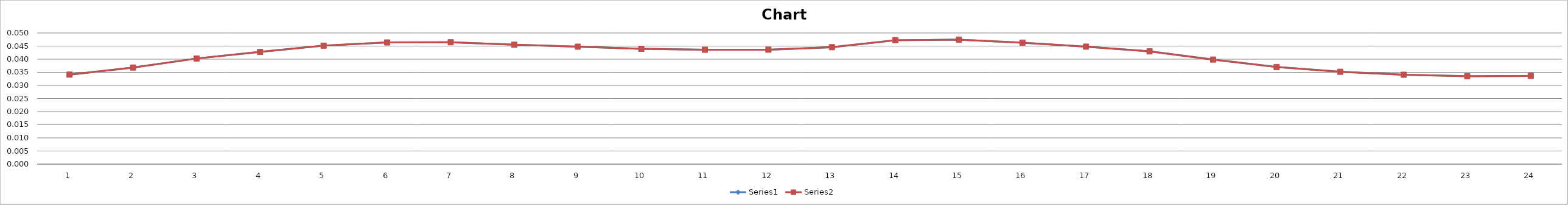
| Category | Series 0 | Series 1 |
|---|---|---|
| 0 | 0.034 | 0.034 |
| 1 | 0.037 | 0.037 |
| 2 | 0.04 | 0.04 |
| 3 | 0.043 | 0.043 |
| 4 | 0.045 | 0.045 |
| 5 | 0.046 | 0.046 |
| 6 | 0.046 | 0.046 |
| 7 | 0.046 | 0.046 |
| 8 | 0.045 | 0.045 |
| 9 | 0.044 | 0.044 |
| 10 | 0.044 | 0.044 |
| 11 | 0.044 | 0.044 |
| 12 | 0.045 | 0.045 |
| 13 | 0.047 | 0.047 |
| 14 | 0.047 | 0.047 |
| 15 | 0.046 | 0.046 |
| 16 | 0.045 | 0.045 |
| 17 | 0.043 | 0.043 |
| 18 | 0.04 | 0.04 |
| 19 | 0.037 | 0.037 |
| 20 | 0.035 | 0.035 |
| 21 | 0.034 | 0.034 |
| 22 | 0.034 | 0.034 |
| 23 | 0.034 | 0.034 |